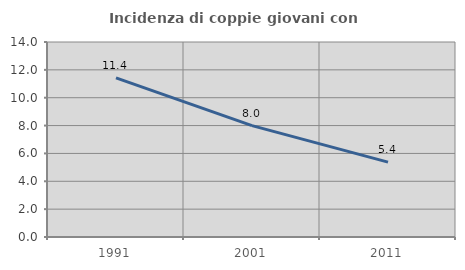
| Category | Incidenza di coppie giovani con figli |
|---|---|
| 1991.0 | 11.429 |
| 2001.0 | 7.993 |
| 2011.0 | 5.374 |